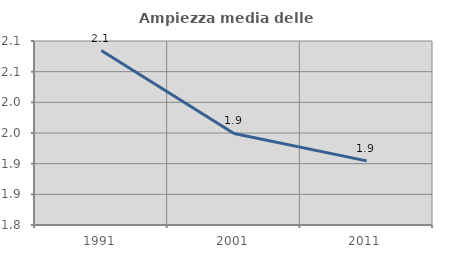
| Category | Ampiezza media delle famiglie |
|---|---|
| 1991.0 | 2.084 |
| 2001.0 | 1.949 |
| 2011.0 | 1.905 |